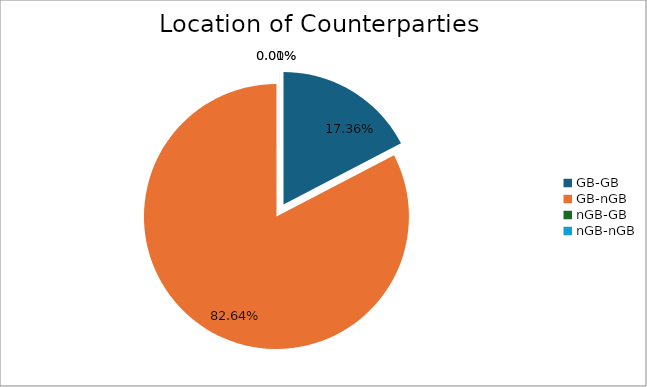
| Category | Series 0 |
|---|---|
| GB-GB | 1656014.418 |
| GB-nGB | 7884480.071 |
| nGB-GB | 0 |
| nGB-nGB | 738.727 |